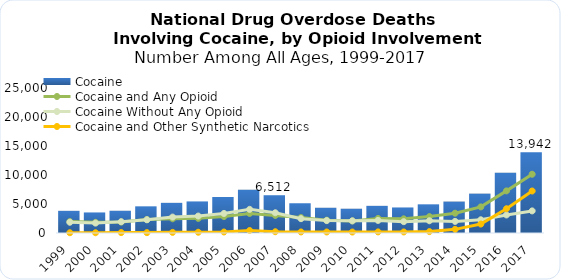
| Category | Cocaine |
|---|---|
| 1999.0 | 3822 |
| 2000.0 | 3544 |
| 2001.0 | 3833 |
| 2002.0 | 4599 |
| 2003.0 | 5199 |
| 2004.0 | 5443 |
| 2005.0 | 6208 |
| 2006.0 | 7448 |
| 2007.0 | 6512 |
| 2008.0 | 5129 |
| 2009.0 | 4350 |
| 2010.0 | 4183 |
| 2011.0 | 4681 |
| 2012.0 | 4404 |
| 2013.0 | 4944 |
| 2014.0 | 5415 |
| 2015.0 | 6784 |
| 2016.0 | 10375 |
| 2017.0 | 13942 |